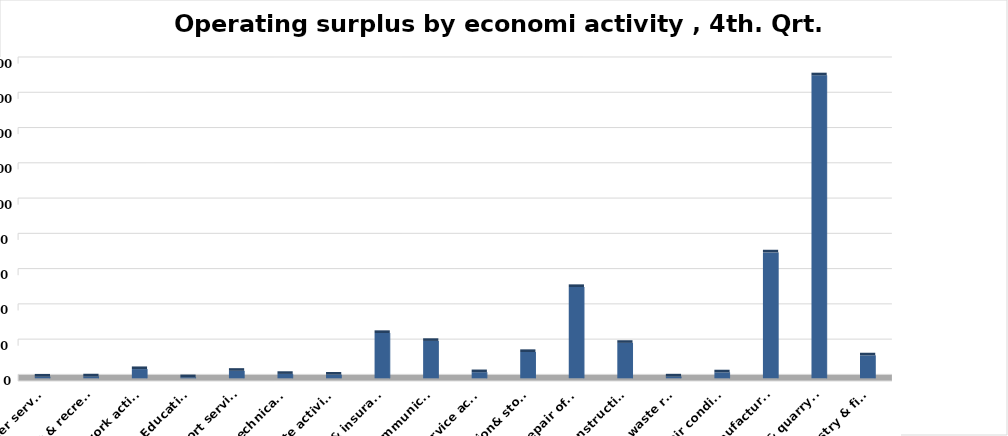
| Category | Series 0 |
|---|---|
| Agriculture, forestry & fishing | 13009992832 |
| Mining & quarrying | 171834883764 |
| Manufacturing | 71407449562 |
| Electricity, gas, steam & air conditioning supply | 3372769248 |
| Water supply; sewerage, waste remediation  | 1053611630 |
| Construction | 20099066698 |
| Wholesale& retail trade; repair of motor vehicles | 51787985973 |
| Transportation& storage | 14930628970 |
| Accommodation & food service activities | 3481525881 |
| Information & communication | 21205272269 |
| Financial & insurance | 25712181318 |
| Real estate activities | 2082518525 |
| Professional, scientific & technical activities | 2500328878 |
| Administrative and support service activities | 4258047719 |
| Education | 613136796 |
| Human health and &l work activities | 5237107497 |
| Arts, entertainment & recreation | 1084950375 |
| Other service | 984822570 |